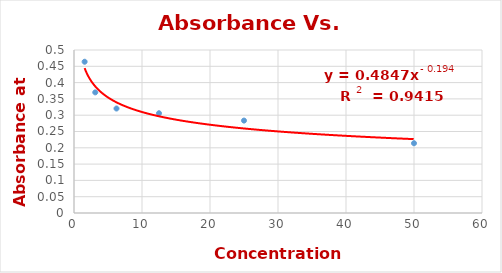
| Category | Series 0 |
|---|---|
| 50.0 | 0.214 |
| 25.0 | 0.284 |
| 12.5 | 0.306 |
| 6.25 | 0.32 |
| 3.125 | 0.37 |
| 1.5625 | 0.464 |